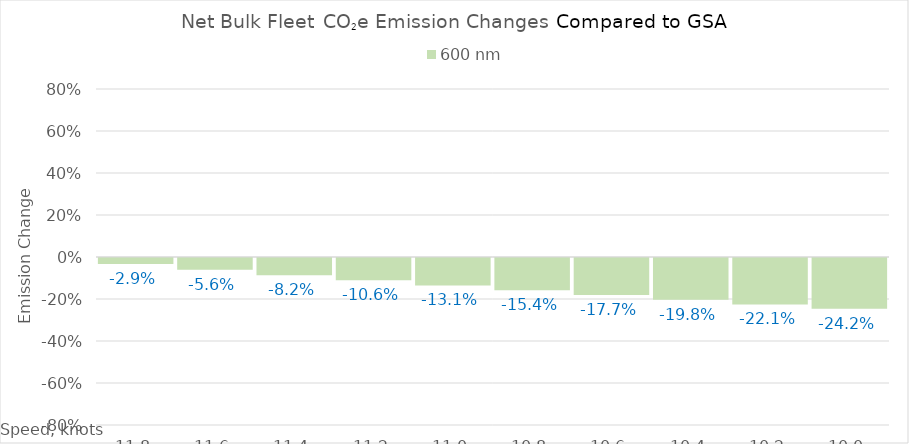
| Category | 600 |
|---|---|
| 11.8 | -0.029 |
| 11.600000000000001 | -0.056 |
| 11.400000000000002 | -0.082 |
| 11.200000000000003 | -0.106 |
| 11.000000000000004 | -0.131 |
| 10.800000000000004 | -0.154 |
| 10.600000000000005 | -0.177 |
| 10.400000000000006 | -0.198 |
| 10.200000000000006 | -0.221 |
| 10.000000000000007 | -0.242 |